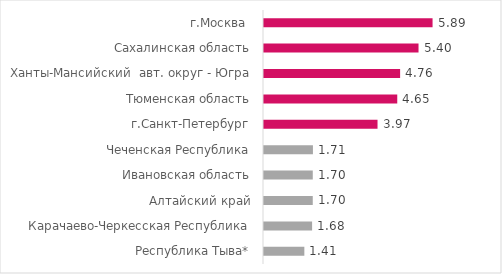
| Category | Средние накопления россиян, тыс руб |
|---|---|
| Республика Тыва* | 1.409 |
| Карачаево-Черкесская Республика | 1.68 |
| Алтайский край | 1.704 |
| Ивановская область | 1.704 |
| Чеченская Республика | 1.709 |
| г.Санкт-Петербург | 3.966 |
| Тюменская область | 4.655 |
| Ханты-Мансийский  авт. округ - Югра | 4.755 |
| Сахалинская область | 5.398 |
| г.Москва  | 5.889 |